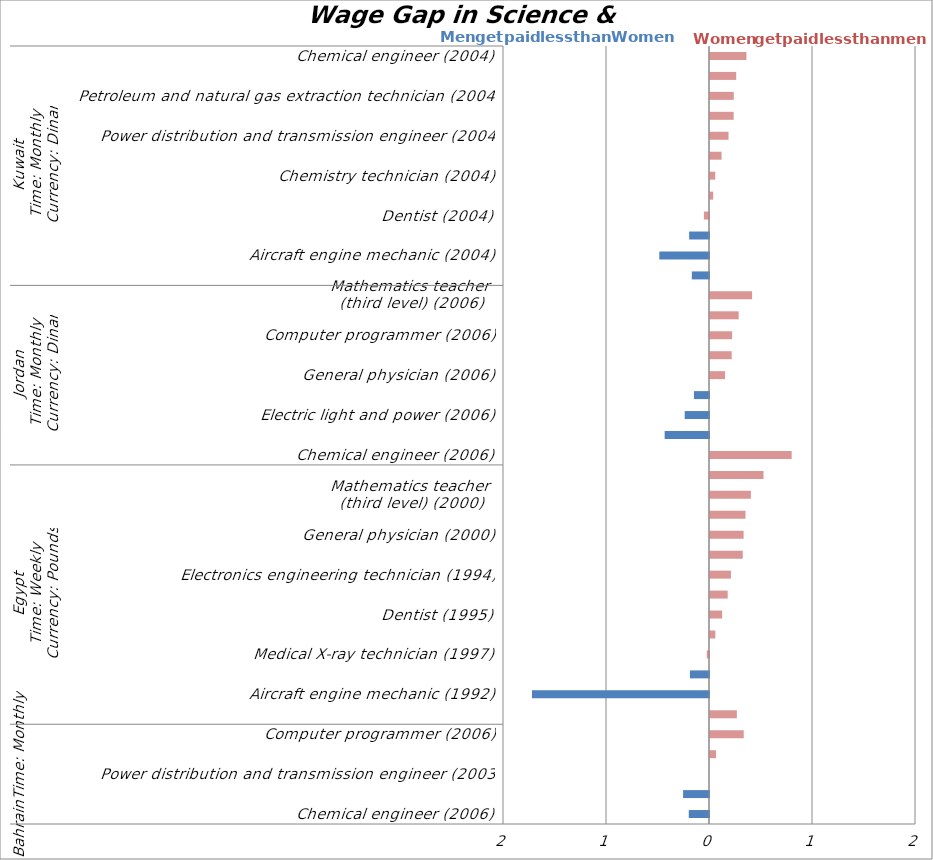
| Category | Series 0 |
|---|---|
| 0 | -0.196 |
| 1 | -0.252 |
| 2 | 0 |
| 3 | 0.058 |
| 4 | 0.327 |
| 5 | 0.261 |
| 6 | -1.719 |
| 7 | -0.185 |
| 8 | -0.022 |
| 9 | 0.052 |
| 10 | 0.118 |
| 11 | 0.172 |
| 12 | 0.203 |
| 13 | 0.318 |
| 14 | 0.326 |
| 15 | 0.344 |
| 16 | 0.397 |
| 17 | 0.52 |
| 18 | 0.793 |
| 19 | -0.431 |
| 20 | -0.236 |
| 21 | -0.146 |
| 22 | 0.146 |
| 23 | 0.211 |
| 24 | 0.214 |
| 25 | 0.278 |
| 26 | 0.408 |
| 27 | -0.167 |
| 28 | -0.482 |
| 29 | -0.193 |
| 30 | -0.05 |
| 31 | 0.031 |
| 32 | 0.051 |
| 33 | 0.112 |
| 34 | 0.18 |
| 35 | 0.23 |
| 36 | 0.231 |
| 37 | 0.254 |
| 38 | 0.353 |